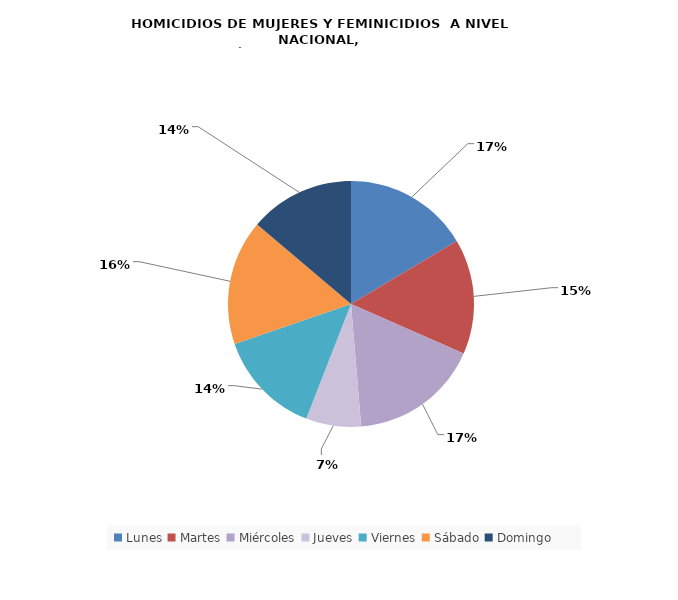
| Category | Lunes |
|---|---|
| Lunes | 25 |
| Martes | 23 |
| Miércoles | 26 |
| Jueves | 11 |
| Viernes | 21 |
| Sábado | 25 |
| Domingo | 21 |